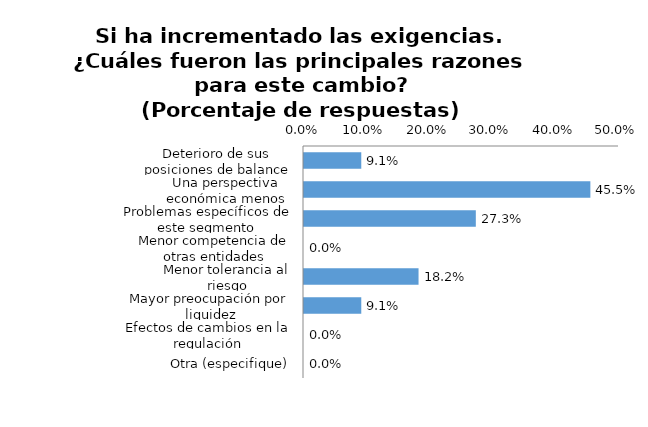
| Category | Series 0 |
|---|---|
| Deterioro de sus posiciones de balance | 0.091 |
| Una perspectiva económica menos favorable o incierta | 0.455 |
| Problemas específicos de este segmento | 0.273 |
| Menor competencia de otras entidades | 0 |
| Menor tolerancia al riesgo | 0.182 |
| Mayor preocupación por liquidez | 0.091 |
| Efectos de cambios en la regulación | 0 |
| Otra (especifique) | 0 |